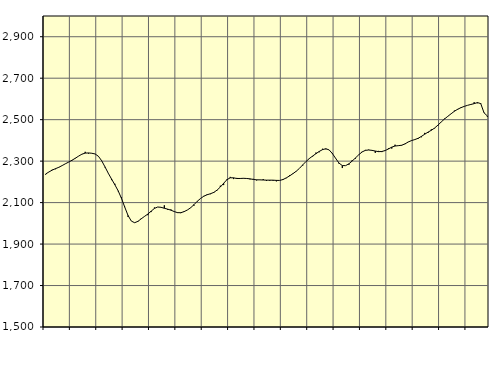
| Category | Piggar | Series 1 |
|---|---|---|
| nan | 2235.2 | 2238.07 |
| 87.0 | 2248 | 2247.77 |
| 87.0 | 2258.7 | 2256.79 |
| 87.0 | 2261.1 | 2263.73 |
| nan | 2269.2 | 2270.29 |
| 88.0 | 2278.3 | 2278.61 |
| 88.0 | 2286.8 | 2287.31 |
| 88.0 | 2295.1 | 2295.56 |
| nan | 2302.8 | 2304.44 |
| 89.0 | 2315.4 | 2313.88 |
| 89.0 | 2324.6 | 2324.27 |
| 89.0 | 2334.2 | 2333.53 |
| nan | 2344.9 | 2338.76 |
| 90.0 | 2336.5 | 2339.51 |
| 90.0 | 2337.7 | 2338.01 |
| 90.0 | 2334.8 | 2334.57 |
| nan | 2324.6 | 2323.56 |
| 91.0 | 2302.7 | 2301.9 |
| 91.0 | 2269.9 | 2272.43 |
| 91.0 | 2240.9 | 2241.71 |
| nan | 2208.5 | 2213.39 |
| 92.0 | 2190.7 | 2186.06 |
| 92.0 | 2154.6 | 2156.76 |
| 92.0 | 2125.3 | 2120.67 |
| nan | 2079.9 | 2078.05 |
| 93.0 | 2031 | 2037.69 |
| 93.0 | 2010.7 | 2010.76 |
| 93.0 | 2003.6 | 2002.97 |
| nan | 2011.4 | 2009.57 |
| 94.0 | 2024.1 | 2021.88 |
| 94.0 | 2034.2 | 2033.52 |
| 94.0 | 2039.3 | 2044.78 |
| nan | 2054.3 | 2058.54 |
| 95.0 | 2076.3 | 2071.97 |
| 95.0 | 2078.9 | 2078.75 |
| 95.0 | 2077.3 | 2077.29 |
| nan | 2086.9 | 2072.66 |
| 96.0 | 2065.4 | 2068.48 |
| 96.0 | 2067 | 2063.51 |
| 96.0 | 2057.8 | 2056.82 |
| nan | 2049.8 | 2051.5 |
| 97.0 | 2049.3 | 2051.26 |
| 97.0 | 2058.5 | 2056.44 |
| 97.0 | 2064.6 | 2064.35 |
| nan | 2074.3 | 2075.24 |
| 98.0 | 2085 | 2090.03 |
| 98.0 | 2108 | 2106.24 |
| 98.0 | 2119.9 | 2119.99 |
| nan | 2132.3 | 2130.99 |
| 99.0 | 2140.6 | 2137.99 |
| 99.0 | 2140.8 | 2142.72 |
| 99.0 | 2146.2 | 2149.23 |
| nan | 2158.8 | 2160.11 |
| 0.0 | 2181.5 | 2175.11 |
| 0.0 | 2184.5 | 2193.18 |
| 0.0 | 2213.5 | 2210.47 |
| nan | 2224 | 2219.69 |
| 1.0 | 2213.5 | 2219.41 |
| 1.0 | 2219 | 2216.24 |
| 1.0 | 2216.7 | 2216.34 |
| nan | 2218.3 | 2217.19 |
| 2.0 | 2217.2 | 2216.32 |
| 2.0 | 2212.2 | 2214.56 |
| 2.0 | 2214.5 | 2211.74 |
| nan | 2206.9 | 2209.84 |
| 3.0 | 2210.1 | 2209.61 |
| 3.0 | 2213 | 2208.93 |
| 3.0 | 2204.3 | 2208.23 |
| nan | 2205.4 | 2208.25 |
| 4.0 | 2205.4 | 2208.12 |
| 4.0 | 2202.5 | 2207.12 |
| 4.0 | 2206.9 | 2206.9 |
| nan | 2213.6 | 2211.21 |
| 5.0 | 2217.8 | 2219.19 |
| 5.0 | 2232.2 | 2228.64 |
| 5.0 | 2240.9 | 2239.33 |
| nan | 2252.1 | 2251.02 |
| 6.0 | 2265 | 2265.19 |
| 6.0 | 2278.8 | 2282.04 |
| 6.0 | 2298.2 | 2298.35 |
| nan | 2311 | 2312.62 |
| 7.0 | 2322.2 | 2324.66 |
| 7.0 | 2341.2 | 2335.86 |
| 7.0 | 2342.8 | 2346.71 |
| nan | 2359.7 | 2355.52 |
| 8.0 | 2357.1 | 2359.75 |
| 8.0 | 2354.1 | 2354.13 |
| 8.0 | 2339.2 | 2336.35 |
| nan | 2311.8 | 2312.71 |
| 9.0 | 2287.5 | 2290.52 |
| 9.0 | 2266.7 | 2278.63 |
| 9.0 | 2278.2 | 2278.28 |
| nan | 2282.3 | 2287.14 |
| 10.0 | 2305 | 2300.58 |
| 10.0 | 2312.3 | 2315.52 |
| 10.0 | 2330.4 | 2330.89 |
| nan | 2345.2 | 2344.21 |
| 11.0 | 2354 | 2352.03 |
| 11.0 | 2355.2 | 2353.64 |
| 11.0 | 2351.3 | 2351.99 |
| nan | 2340.1 | 2348.71 |
| 12.0 | 2349.4 | 2345.75 |
| 12.0 | 2343.6 | 2346.48 |
| 12.0 | 2352.7 | 2351.11 |
| nan | 2361.9 | 2358.79 |
| 13.0 | 2360.7 | 2367.5 |
| 13.0 | 2379.2 | 2372.9 |
| 13.0 | 2375.5 | 2374.61 |
| nan | 2375 | 2376.63 |
| 14.0 | 2381.9 | 2383.1 |
| 14.0 | 2392.9 | 2392.26 |
| 14.0 | 2398.1 | 2399.23 |
| nan | 2404.9 | 2403.98 |
| 15.0 | 2407.2 | 2410.07 |
| 15.0 | 2415.2 | 2419.29 |
| 15.0 | 2436.2 | 2429.84 |
| nan | 2436 | 2439.87 |
| 16.0 | 2453.4 | 2448.8 |
| 16.0 | 2457.9 | 2459.66 |
| 16.0 | 2471.3 | 2473.5 |
| nan | 2488.4 | 2488.86 |
| 17.0 | 2505 | 2503.23 |
| 17.0 | 2515.6 | 2515.98 |
| 17.0 | 2528.3 | 2528.43 |
| nan | 2543.6 | 2540.49 |
| 18.0 | 2548.1 | 2550.27 |
| 18.0 | 2556.5 | 2557.94 |
| 18.0 | 2563.4 | 2564.17 |
| nan | 2569.1 | 2569.16 |
| 19.0 | 2572.6 | 2573.36 |
| 19.0 | 2584.3 | 2577.37 |
| 19.0 | 2579.2 | 2582.41 |
| nan | 2580 | 2577.38 |
| 20.0 | 2533.9 | 2532.82 |
| 20.0 | 2514.1 | 2517.96 |